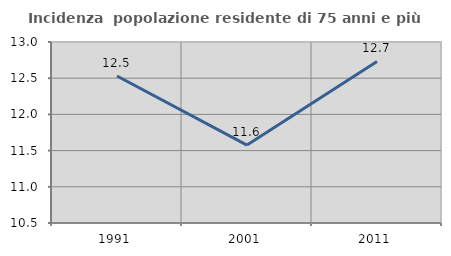
| Category | Incidenza  popolazione residente di 75 anni e più |
|---|---|
| 1991.0 | 12.531 |
| 2001.0 | 11.576 |
| 2011.0 | 12.732 |